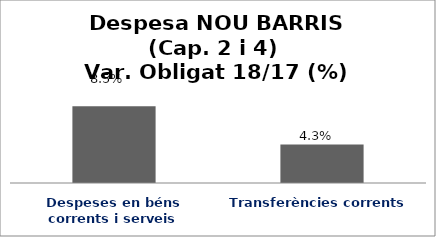
| Category | Series 0 |
|---|---|
| Despeses en béns corrents i serveis | 0.085 |
| Transferències corrents | 0.043 |